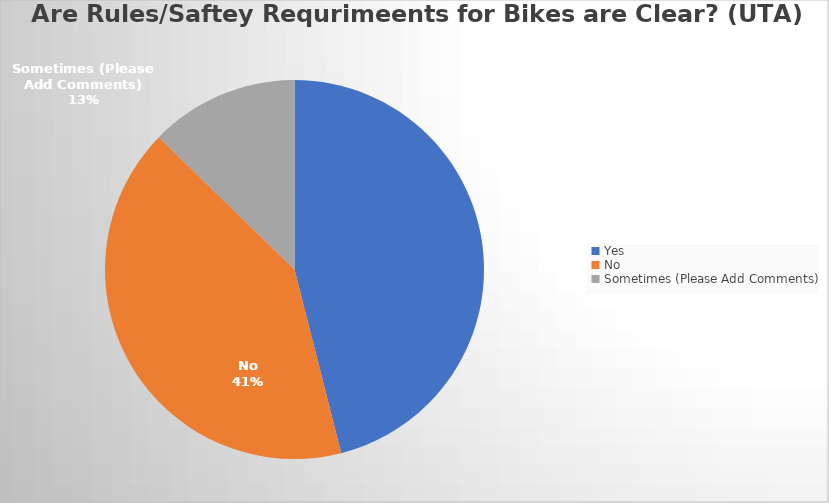
| Category | Series 0 |
|---|---|
| Yes | 29 |
| No | 26 |
| Sometimes (Please Add Comments) | 8 |